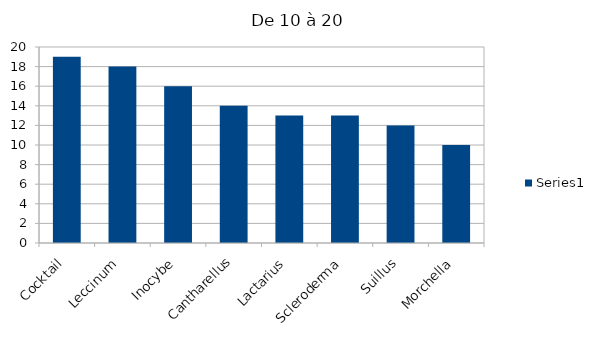
| Category | Series 0 |
|---|---|
| Cocktail | 19 |
| Leccinum | 18 |
| Inocybe | 16 |
| Cantharellus | 14 |
| Lactarius | 13 |
| Scleroderma | 13 |
| Suillus | 12 |
| Morchella | 10 |